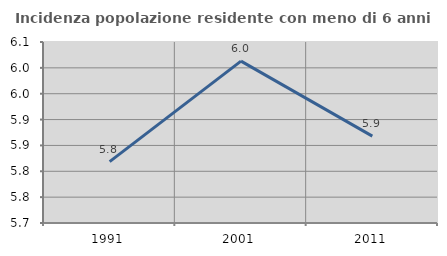
| Category | Incidenza popolazione residente con meno di 6 anni |
|---|---|
| 1991.0 | 5.819 |
| 2001.0 | 6.013 |
| 2011.0 | 5.868 |